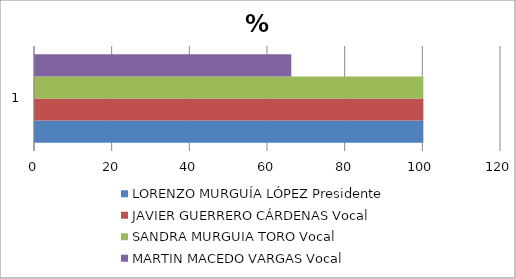
| Category | LORENZO MURGUÍA LÓPEZ Presidente | JAVIER GUERRERO CÁRDENAS Vocal | SANDRA MURGUIA TORO Vocal | MARTIN MACEDO VARGAS Vocal |
|---|---|---|---|---|
| 0 | 100 | 100 | 100 | 66 |